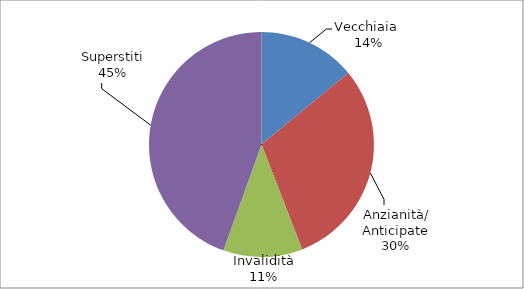
| Category | Series 0 |
|---|---|
| Vecchiaia  | 5427 |
| Anzianità/ Anticipate | 11630 |
| Invalidità | 4401 |
| Superstiti | 17209 |